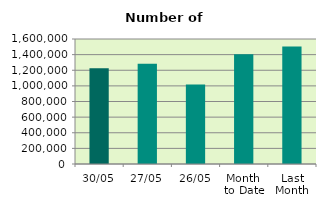
| Category | Series 0 |
|---|---|
| 30/05 | 1226946 |
| 27/05 | 1284588 |
| 26/05 | 1017656 |
| Month 
to Date | 1404928.762 |
| Last
Month | 1505043.474 |